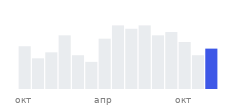
| Category | Количество |
|---|---|
| окт |  |
|  |  |
|  |  |
|  |  |
|  |  |
|  |  |
| апр |  |
|  |  |
|  |  |
|  |  |
|  |  |
|  |  |
| окт |  |